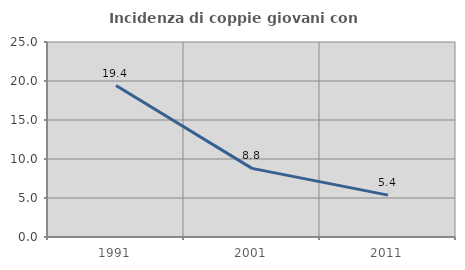
| Category | Incidenza di coppie giovani con figli |
|---|---|
| 1991.0 | 19.417 |
| 2001.0 | 8.796 |
| 2011.0 | 5.372 |